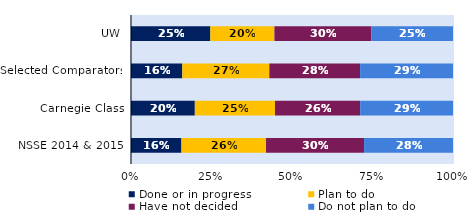
| Category | Done or in progress | Plan to do | Have not decided | Do not plan to do |
|---|---|---|---|---|
| UW | 0.246 | 0.199 | 0.301 | 0.254 |
| Selected Comparators | 0.159 | 0.27 | 0.282 | 0.289 |
| Carnegie Class | 0.198 | 0.249 | 0.265 | 0.288 |
| NSSE 2014 & 2015 | 0.157 | 0.263 | 0.305 | 0.276 |